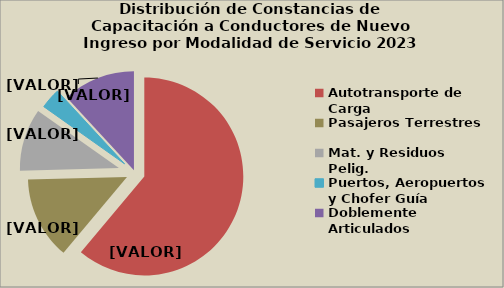
| Category | Series 0 |
|---|---|
| Autotransporte de Carga | 61.074 |
| Pasajeros Terrestres | 13.502 |
| Mat. y Residuos Pelig. | 10.229 |
| Puertos, Aeropuertos y Chofer Guía | 3.333 |
| Doblemente Articulados | 11.862 |